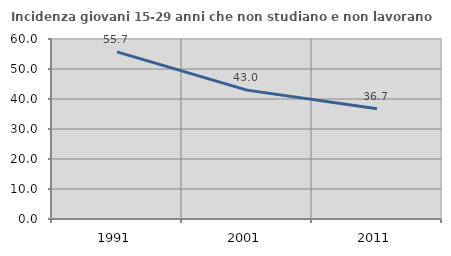
| Category | Incidenza giovani 15-29 anni che non studiano e non lavorano  |
|---|---|
| 1991.0 | 55.711 |
| 2001.0 | 42.953 |
| 2011.0 | 36.736 |